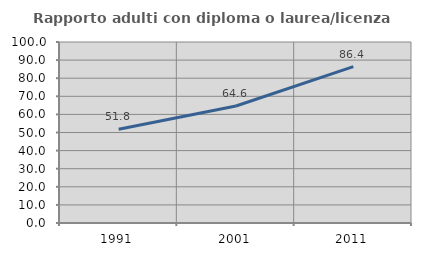
| Category | Rapporto adulti con diploma o laurea/licenza media  |
|---|---|
| 1991.0 | 51.838 |
| 2001.0 | 64.634 |
| 2011.0 | 86.364 |